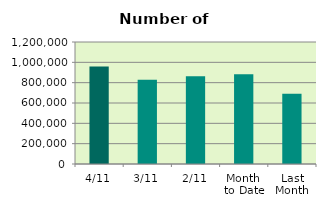
| Category | Series 0 |
|---|---|
| 4/11 | 958070 |
| 3/11 | 827908 |
| 2/11 | 862652 |
| Month 
to Date | 882876.667 |
| Last
Month | 689792.182 |